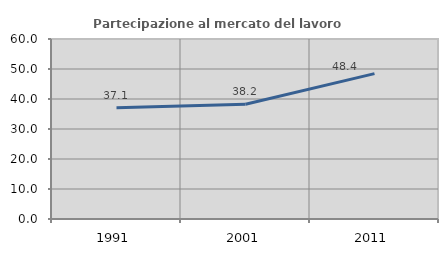
| Category | Partecipazione al mercato del lavoro  femminile |
|---|---|
| 1991.0 | 37.119 |
| 2001.0 | 38.243 |
| 2011.0 | 48.447 |